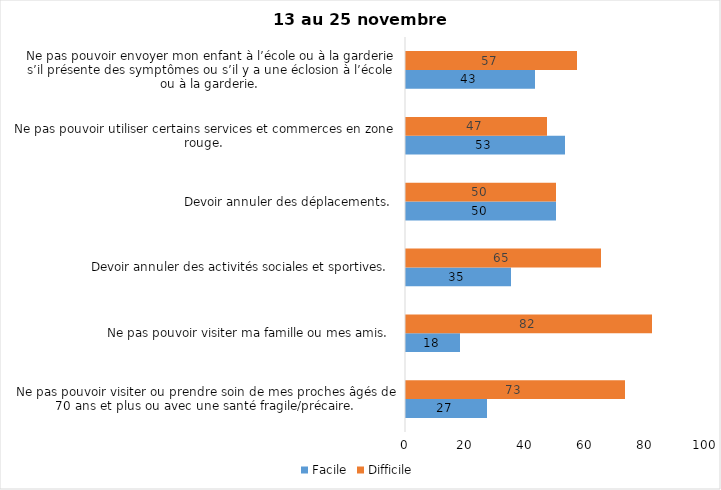
| Category | Facile | Difficile |
|---|---|---|
| Ne pas pouvoir visiter ou prendre soin de mes proches âgés de 70 ans et plus ou avec une santé fragile/précaire.  | 27 | 73 |
| Ne pas pouvoir visiter ma famille ou mes amis.  | 18 | 82 |
| Devoir annuler des activités sociales et sportives.  | 35 | 65 |
| Devoir annuler des déplacements.  | 50 | 50 |
| Ne pas pouvoir utiliser certains services et commerces en zone rouge.  | 53 | 47 |
| Ne pas pouvoir envoyer mon enfant à l’école ou à la garderie s’il présente des symptômes ou s’il y a une éclosion à l’école ou à la garderie.  | 43 | 57 |